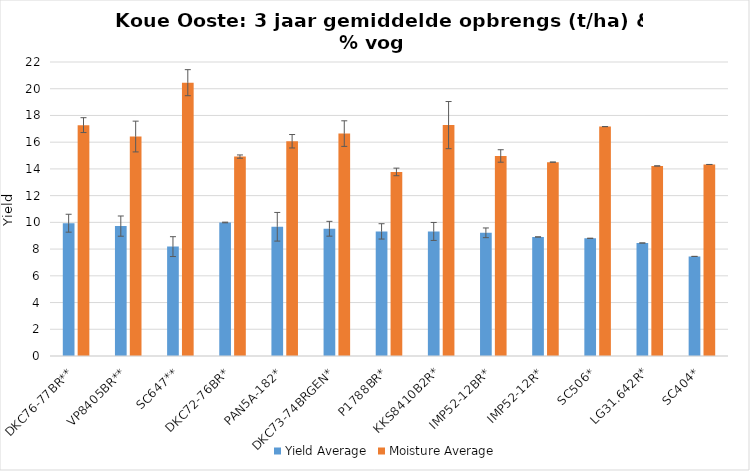
| Category | Yield Average | Moisture Average |
|---|---|---|
| DKC76-77BR** | 9.937 | 17.276 |
| VP8405BR** | 9.72 | 16.423 |
| SC647** | 8.185 | 20.453 |
| DKC72-76BR* | 9.991 | 14.921 |
| PAN5A-182* | 9.67 | 16.07 |
| DKC73-74BRGEN* | 9.522 | 16.643 |
| P1788BR* | 9.326 | 13.774 |
| KKS8410B2R* | 9.321 | 17.278 |
| IMP52-12BR* | 9.218 | 14.969 |
| IMP52-12R* | 8.908 | 14.506 |
| SC506* | 8.806 | 17.167 |
| LG31.642R* | 8.455 | 14.221 |
| SC404* | 7.452 | 14.332 |